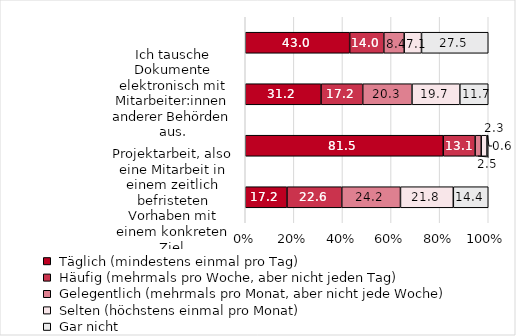
| Category | Series 0 | Series 1 | Series 2 | Series 3 | Series 4 |
|---|---|---|---|---|---|
| Projektarbeit, also eine Mitarbeit in einem zeitlich befristeten Vorhaben mit einem konkreten Ziel. | 17.166 | 22.555 | 24.152 | 21.756 | 14.371 |
| Ich kommuniziere elektronisch mit Personen innerhalb und außerhalb meiner Behörde. | 81.467 | 13.127 | 2.51 | 2.317 | 0.579 |
| Ich tausche Dokumente elektronisch mit Mitarbeiter:innen anderer Behörden aus. | 31.189 | 17.154 | 20.273 | 19.688 | 11.696 |
| Ich nutze elektronische Dokumentenmanagementsysteme.  | 42.977 | 14.046 | 8.386 | 7.128 | 27.463 |